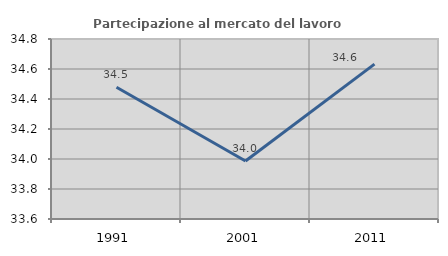
| Category | Partecipazione al mercato del lavoro  femminile |
|---|---|
| 1991.0 | 34.478 |
| 2001.0 | 33.987 |
| 2011.0 | 34.633 |